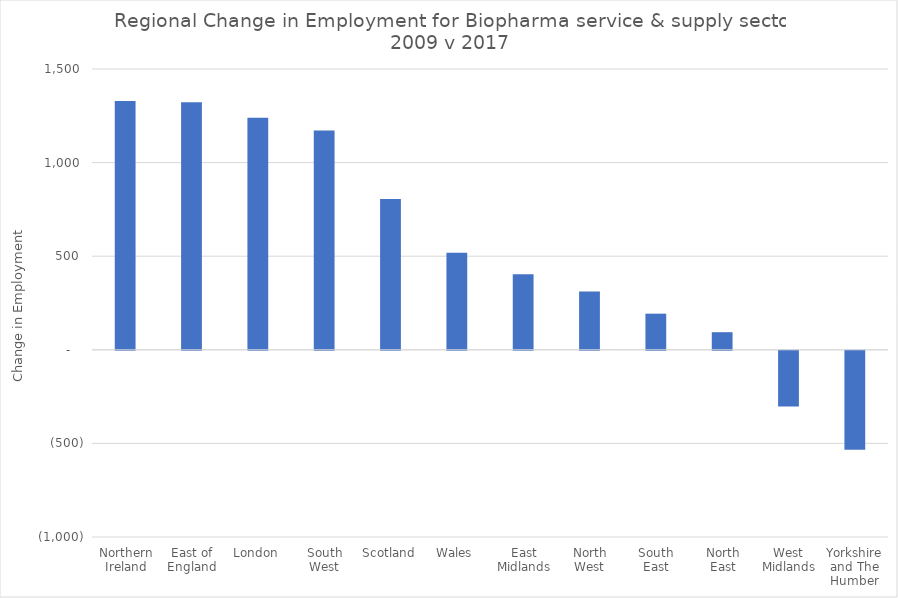
| Category | Change in Employment for Biopharma service & supply  2009 to 2017 |
|---|---|
| Northern Ireland | 1329 |
| East of England | 1322 |
| London | 1239 |
| South West | 1172 |
| Scotland | 805 |
| Wales | 519 |
| East Midlands | 403 |
| North West | 311 |
| South East | 193 |
| North East | 94 |
| West Midlands | -298 |
| Yorkshire and The Humber | -528 |